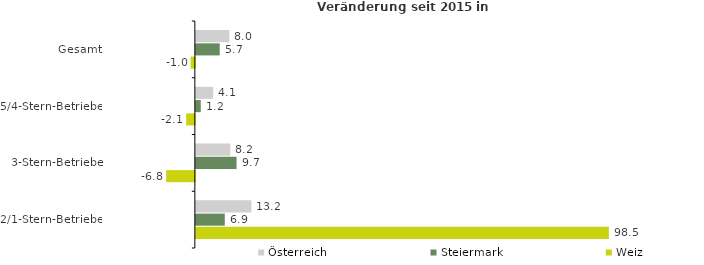
| Category | Österreich | Steiermark | Weiz |
|---|---|---|---|
| Gesamt | 7.97 | 5.689 | -1.014 |
| 5/4-Stern-Betriebe | 4.13 | 1.174 | -2.081 |
| 3-Stern-Betriebe | 8.22 | 9.709 | -6.846 |
| 2/1-Stern-Betriebe | 13.246 | 6.904 | 98.505 |